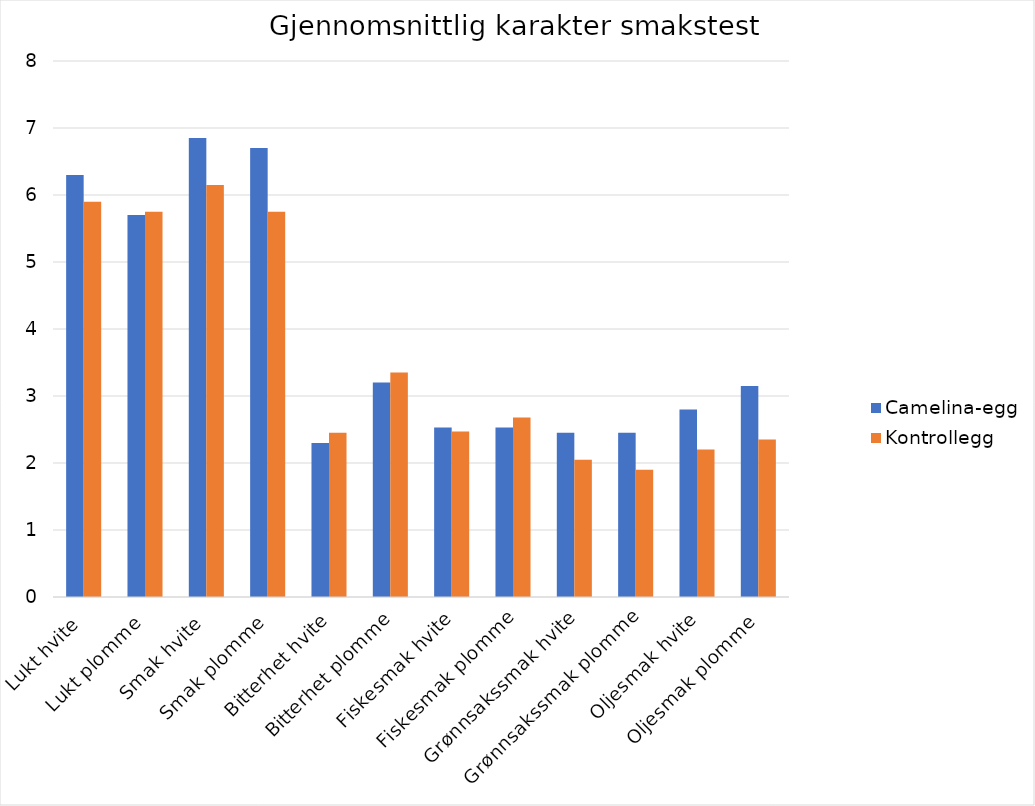
| Category | Camelina-egg | Kontrollegg |
|---|---|---|
| Lukt hvite | 6.3 | 5.9 |
| Lukt plomme | 5.7 | 5.75 |
| Smak hvite | 6.85 | 6.15 |
| Smak plomme | 6.7 | 5.75 |
| Bitterhet hvite | 2.3 | 2.45 |
| Bitterhet plomme | 3.2 | 3.35 |
| Fiskesmak hvite | 2.53 | 2.47 |
| Fiskesmak plomme | 2.53 | 2.68 |
| Grønnsakssmak hvite | 2.45 | 2.05 |
| Grønnsakssmak plomme | 2.45 | 1.9 |
| Oljesmak hvite | 2.8 | 2.2 |
| Oljesmak plomme | 3.15 | 2.35 |